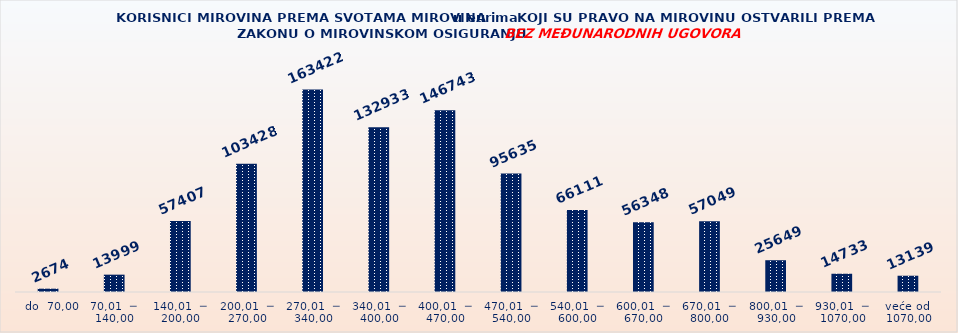
| Category | KORISNICI MIROVINA PREMA VRSTAMA I SVOTAMA MIROVINA KOJI SU PRAVO NA MIROVINU OSTVARILI PREMA ZAKONU O MIROVINSKOM OSIGURANJU 
BEZ MEĐUNARODNIH UGOVORA |
|---|---|
|   do  70,00 | 2674 |
| 70,01  ─  140,00 | 13999 |
| 140,01  ─  200,00 | 57407 |
| 200,01  ─  270,00 | 103428 |
| 270,01  ─  340,00 | 163422 |
| 340,01  ─  400,00 | 132933 |
| 400,01  ─  470,00 | 146743 |
| 470,01  ─  540,00 | 95635 |
| 540,01  ─  600,00 | 66111 |
| 600,01  ─  670,00 | 56348 |
| 670,01  ─  800,00 | 57049 |
| 800,01  ─  930,00 | 25649 |
| 930,01  ─  1070,00 | 14733 |
| veće od  1070,00 | 13139 |